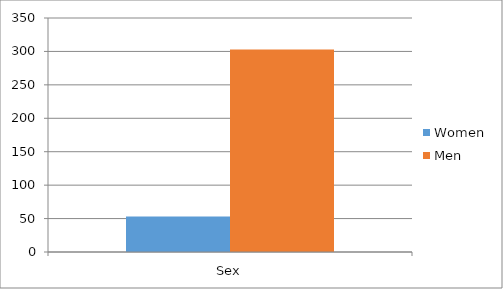
| Category | Women | Men |
|---|---|---|
| Sex | 53 | 303 |